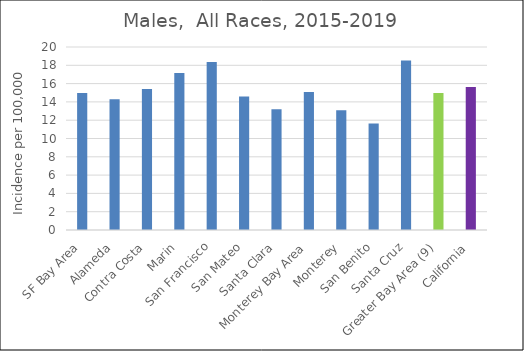
| Category | Male |
|---|---|
| SF Bay Area | 14.96 |
|   Alameda | 14.28 |
|   Contra Costa | 15.41 |
|   Marin | 17.15 |
|   San Francisco | 18.36 |
|   San Mateo | 14.6 |
|   Santa Clara | 13.19 |
| Monterey Bay Area | 15.07 |
|   Monterey | 13.08 |
|   San Benito | 11.63 |
|   Santa Cruz | 18.52 |
| Greater Bay Area (9) | 14.98 |
| California | 15.63 |